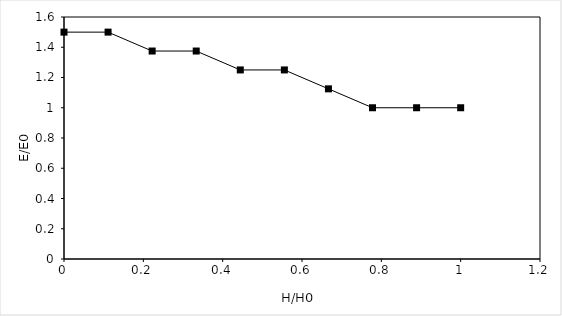
| Category | Head (feet) |
|---|---|
| 1.0 | 1 |
| 0.888888888888889 | 1 |
| 0.777777777777778 | 1 |
| 0.6666666666666669 | 1.125 |
| 0.5555555555555558 | 1.25 |
| 0.44444444444444464 | 1.25 |
| 0.3333333333333335 | 1.375 |
| 0.22222222222222232 | 1.375 |
| 0.11111111111111116 | 1.5 |
| 0.0 | 1.5 |